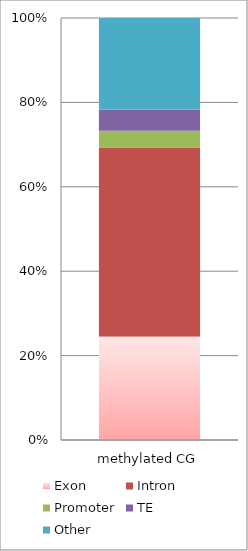
| Category | Exon | Intron | Promoter | TE | Other |
|---|---|---|---|---|---|
| methylated CG | 356323 | 651253 | 57498 | 73083 | 315596 |